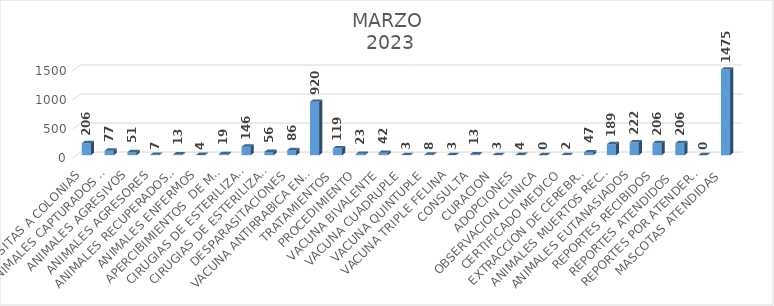
| Category | Series 0 |
|---|---|
| VISITAS A COLONIAS | 206 |
| ANIMALES CAPTURADOS PERROS Y GATOS  | 77 |
| ANIMALES AGRESIVOS | 51 |
| ANIMALES AGRESORES | 7 |
| ANIMALES RECUPERADOS POR SUS DUEÑOS | 13 |
| ANIMALES ENFERMOS | 4 |
| APERCIBIMIENTOS  DE MALTRATO ANIMAL | 19 |
| CIRUGIAS DE ESTERILIZACION (OVH) hembra | 146 |
| CIRUGIAS DE ESTERILIZACION (ORQ) macho | 56 |
| DESPARASITACIONES | 86 |
| VACUNA ANTIRRABICA EN OFICINA Y CAMPAÑAS PASEOS DEL PRADO Y FOVISSSTE MIRAVALLE | 920 |
| TRATAMIENTOS | 119 |
| PROCEDIMIENTO | 23 |
| VACUNA BIVALENTE | 42 |
| VACUNA CUADRUPLE | 3 |
| VACUNA QUINTUPLE | 8 |
| VACUNA TRIPLE FELINA | 3 |
| CONSULTA | 13 |
| CURACION | 3 |
| ADOPCIONES | 4 |
| OBSERVACION CLINICA | 0 |
| CERTIFICADO MEDICO | 2 |
| EXTRACCION DE CEREBROS | 47 |
| ANIMALES MUERTOS RECOLECTADOS | 189 |
| ANIMALES EUTANASIADOS | 222 |
| REPORTES RECIBIDOS | 206 |
| REPORTES ATENDIDOS  | 206 |
| REPORTES POR ATENDER (PENDIENTES) | 0 |
| MASCOTAS ATENDIDAS | 1475 |